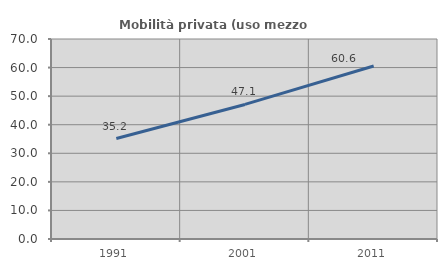
| Category | Mobilità privata (uso mezzo privato) |
|---|---|
| 1991.0 | 35.167 |
| 2001.0 | 47.098 |
| 2011.0 | 60.56 |